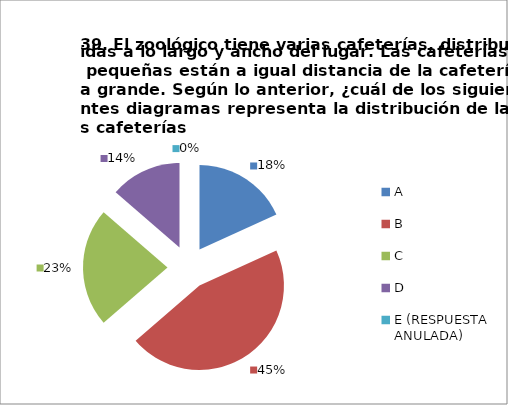
| Category | CANTIDAD DE RESPUESTAS PREGUNTA (39) | PORCENTAJE |
|---|---|---|
| A | 4 | 0.182 |
| B | 10 | 0.455 |
| C | 5 | 0.227 |
| D | 3 | 0.136 |
| E (RESPUESTA ANULADA) | 0 | 0 |